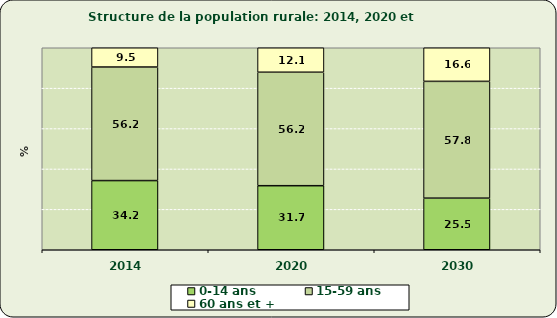
| Category | 0-14 ans  | 15-59 ans | 60 ans et + |
|---|---|---|---|
| 2014.0 | 34.248 | 56.214 | 9.538 |
| 2020.0 | 31.71 | 56.17 | 12.12 |
| 2030.0 | 25.539 | 57.828 | 16.634 |